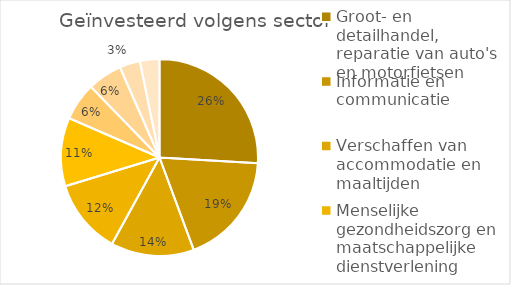
| Category | Series 0 |
|---|---|
| Groot- en detailhandel, reparatie van auto's en motorfietsen | 13.144 |
| Informatie en communicatie | 9.335 |
| Verschaffen van accommodatie en maaltijden | 6.918 |
| Menselijke gezondheidszorg en maatschappelijke dienstverlening | 6.225 |
| Industrie | 5.694 |
| Vrije beroepen en wetenschappelijke en technische activiteiten | 3.152 |
| Bouwnijverheid | 2.884 |
| Administratieve en ondersteunende diensten | 1.707 |
| Kunst amusement en recreatie | 1.626 |